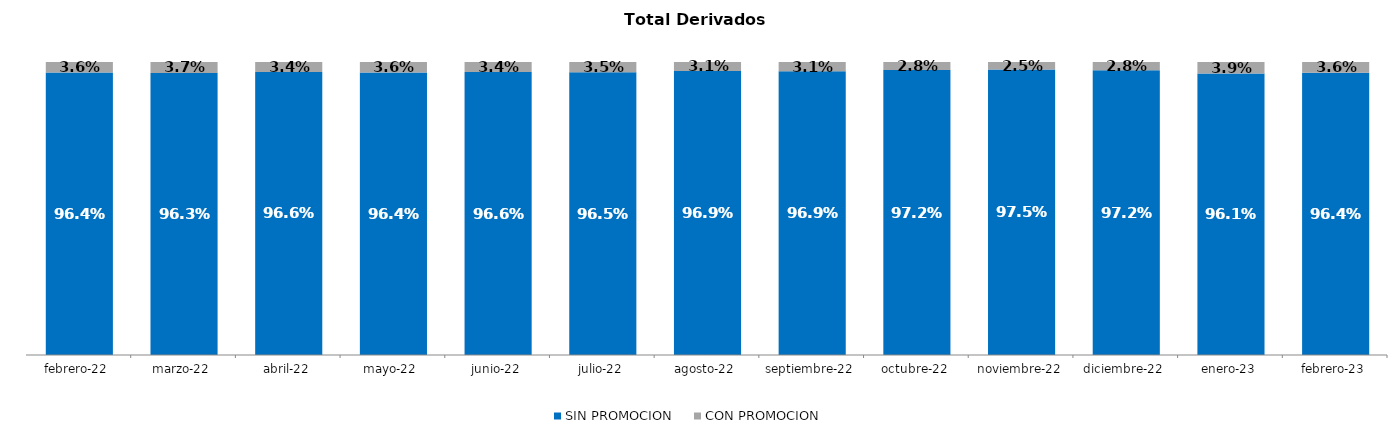
| Category | SIN PROMOCION   | CON PROMOCION   |
|---|---|---|
| 2022-02-01 | 0.964 | 0.036 |
| 2022-03-01 | 0.963 | 0.037 |
| 2022-04-01 | 0.966 | 0.034 |
| 2022-05-01 | 0.964 | 0.036 |
| 2022-06-01 | 0.966 | 0.034 |
| 2022-07-01 | 0.965 | 0.035 |
| 2022-08-01 | 0.969 | 0.031 |
| 2022-09-01 | 0.969 | 0.031 |
| 2022-10-01 | 0.972 | 0.028 |
| 2022-11-01 | 0.975 | 0.025 |
| 2022-12-01 | 0.972 | 0.028 |
| 2023-01-01 | 0.961 | 0.039 |
| 2023-02-01 | 0.964 | 0.036 |